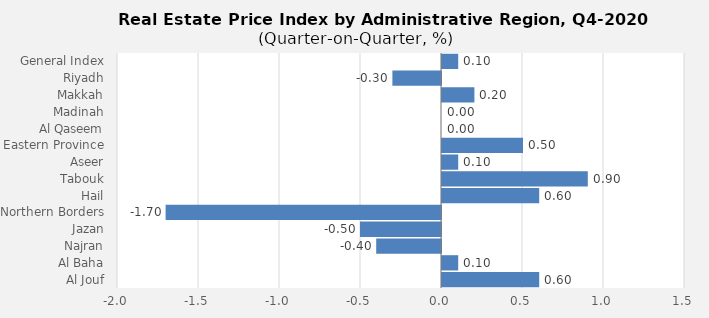
| Category | 2020 |
|---|---|
| General Index | 0.1 |
| Riyadh | -0.3 |
| Makkah | 0.2 |
| Madinah | 0 |
| Al Qaseem | 0 |
| Eastern Province | 0.5 |
| Aseer | 0.1 |
| Tabouk | 0.9 |
| Hail | 0.6 |
| Northern Borders | -1.7 |
| Jazan | -0.5 |
| Najran | -0.4 |
| Al Baha | 0.1 |
| Al Jouf | 0.6 |